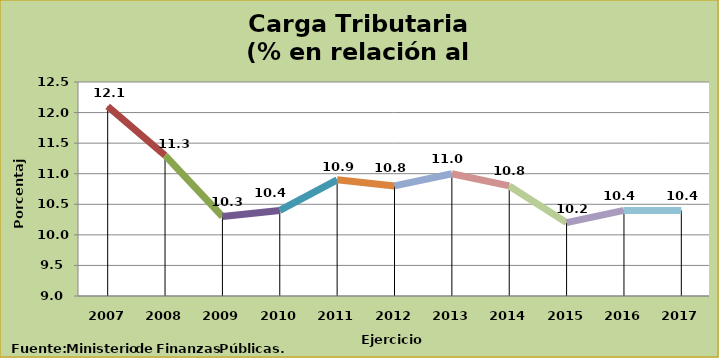
| Category | Series 0 |
|---|---|
| 2007 | 12.1 |
| 2008 | 11.3 |
| 2009 | 10.3 |
| 2010 | 10.4 |
| 2011 | 10.9 |
| 2012 | 10.8 |
| 2013 | 11 |
| 2014 | 10.8 |
| 2015 | 10.2 |
| 2016 | 10.4 |
| 2017 | 10.4 |